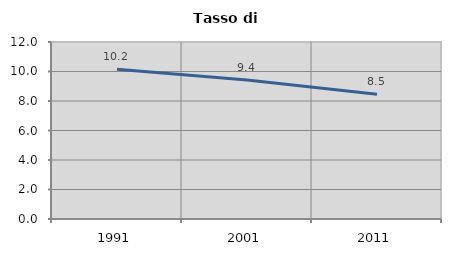
| Category | Tasso di disoccupazione   |
|---|---|
| 1991.0 | 10.156 |
| 2001.0 | 9.423 |
| 2011.0 | 8.458 |